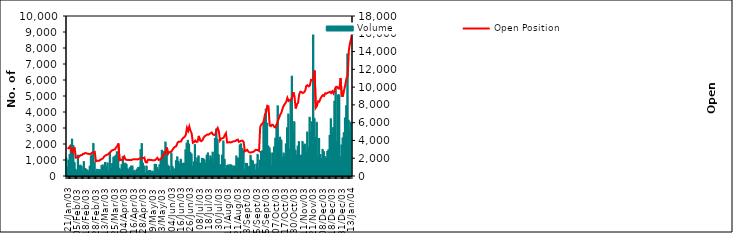
| Category | Volume |
|---|---|
| 2003-01-21 | 1124 |
| 2003-01-22 | 519 |
| 2003-01-23 | 961 |
| 2003-01-24 | 1317 |
| 2003-01-27 | 1909 |
| 2003-01-28 | 2274 |
| 2003-01-29 | 1876 |
| 2003-01-30 | 814 |
| 2003-02-05 | 387 |
| 2003-02-06 | 289 |
| 2003-02-07 | 1270 |
| 2003-02-10 | 597 |
| 2003-02-11 | 648 |
| 2003-02-13 | 585 |
| 2003-02-14 | 279 |
| 2003-02-17 | 871 |
| 2003-02-18 | 443 |
| 2003-02-19 | 394 |
| 2003-02-20 | 337 |
| 2003-02-21 | 273 |
| 2003-02-24 | 582 |
| 2003-02-25 | 1228 |
| 2003-02-26 | 1290 |
| 2003-02-27 | 2004 |
| 2003-02-28 | 819 |
| 2003-03-03 | 236 |
| 2003-03-05 | 389 |
| 2003-03-06 | 221 |
| 2003-03-07 | 376 |
| 2003-03-10 | 339 |
| 2003-03-11 | 620 |
| 2003-03-12 | 662 |
| 2003-03-13 | 519 |
| 2003-03-14 | 819 |
| 2003-03-17 | 548 |
| 2003-03-18 | 791 |
| 2003-03-19 | 304 |
| 2003-03-20 | 1456 |
| 2003-03-21 | 474 |
| 2003-03-24 | 748 |
| 2003-03-25 | 1135 |
| 2003-03-26 | 1189 |
| 2003-03-27 | 1266 |
| 2003-03-28 | 1488 |
| 2003-03-31 | 1140 |
| 2003-04-01 | 457 |
| 2003-04-02 | 374 |
| 2003-04-03 | 675 |
| 2003-04-04 | 1195 |
| 2003-04-07 | 727 |
| 2003-04-08 | 770 |
| 2003-04-09 | 712 |
| 2003-04-10 | 424 |
| 2003-04-11 | 341 |
| 2003-04-14 | 498 |
| 2003-04-15 | 587 |
| 2003-04-16 | 595 |
| 2003-04-17 | 248 |
| 2003-04-18 | 328 |
| 2003-04-21 | 167 |
| 2003-04-22 | 401 |
| 2003-04-23 | 493 |
| 2003-04-24 | 523 |
| 2003-04-25 | 1621 |
| 2003-04-28 | 1996 |
| 2003-04-29 | 770 |
| 2003-04-30 | 591 |
| 2003-05-02 | 148 |
| 2003-05-05 | 592 |
| 2003-05-06 | 250 |
| 2003-05-07 | 307 |
| 2003-05-08 | 318 |
| 2003-05-09 | 225 |
| 2003-05-12 | 275 |
| 2003-05-13 | 208 |
| 2003-05-16 | 699 |
| 2003-05-19 | 692 |
| 2003-05-20 | 506 |
| 2003-05-21 | 369 |
| 2003-05-22 | 663 |
| 2003-05-23 | 991 |
| 2003-05-26 | 1583 |
| 2003-05-27 | 1504 |
| 2003-05-28 | 1466 |
| 2003-05-29 | 2091 |
| 2003-05-30 | 1634 |
| 2003-06-02 | 654 |
| 2003-06-03 | 568 |
| 2003-06-04 | 286 |
| 2003-06-05 | 1412 |
| 2003-06-06 | 576 |
| 2003-06-09 | 379 |
| 2003-06-10 | 416 |
| 2003-06-11 | 926 |
| 2003-06-12 | 1169 |
| 2003-06-13 | 880 |
| 2003-06-16 | 705 |
| 2003-06-17 | 1016 |
| 2003-06-18 | 656 |
| 2003-06-19 | 764 |
| 2003-06-20 | 766 |
| 2003-06-23 | 1603 |
| 2003-06-24 | 2020 |
| 2003-06-25 | 2196 |
| 2003-06-26 | 1965 |
| 2003-06-27 | 1445 |
| 2003-06-30 | 1348 |
| 2003-07-01 | 589 |
| 2003-07-02 | 849 |
| 2003-07-03 | 1931 |
| 2003-07-04 | 856 |
| 2003-07-07 | 1110 |
| 2003-07-08 | 1231 |
| 2003-07-09 | 760 |
| 2003-07-10 | 771 |
| 2003-07-11 | 1073 |
| 2003-07-14 | 1064 |
| 2003-07-15 | 985 |
| 2003-07-16 | 759 |
| 2003-07-17 | 1275 |
| 2003-07-18 | 1413 |
| 2003-07-21 | 950 |
| 2003-07-22 | 1227 |
| 2003-07-23 | 1093 |
| 2003-07-24 | 1461 |
| 2003-07-25 | 813 |
| 2003-07-28 | 2318 |
| 2003-07-29 | 2908 |
| 2003-07-30 | 2265 |
| 2003-07-31 | 1306 |
| 2003-08-01 | 686 |
| 2003-08-04 | 651 |
| 2003-08-05 | 1273 |
| 2003-08-06 | 2160 |
| 2003-08-07 | 1020 |
| 2003-08-08 | 406 |
| 2003-08-11 | 622 |
| 2003-08-12 | 659 |
| 2003-08-13 | 617 |
| 2003-08-14 | 685 |
| 2003-08-15 | 641 |
| 2003-08-18 | 466 |
| 2003-08-19 | 600 |
| 2003-08-20 | 553 |
| 2003-08-21 | 1222 |
| 2003-08-22 | 1060 |
| 2003-08-25 | 1092 |
| 2003-08-26 | 1916 |
| 2003-08-27 | 1975 |
| 2003-08-28 | 1687 |
| 2003-08-29 | 1569 |
| 2003-09-02 | 400 |
| 2003-09-03 | 761 |
| 2003-09-04 | 752 |
| 2003-09-05 | 535 |
| 2003-09-08 | 579 |
| 2003-09-09 | 1261 |
| 2003-09-10 | 953 |
| 2003-09-11 | 912 |
| 2003-09-12 | 696 |
| 2003-09-15 | 337 |
| 2003-09-16 | 717 |
| 2003-09-17 | 1318 |
| 2003-09-18 | 384 |
| 2003-09-19 | 959 |
| 2003-09-22 | 1503 |
| 2003-09-23 | 1544 |
| 2003-09-24 | 3215 |
| 2003-09-25 | 3514 |
| 2003-09-26 | 4146 |
| 2003-09-29 | 3272 |
| 2003-09-30 | 1847 |
| 2003-10-01 | 1734 |
| 2003-10-02 | 1412 |
| 2003-10-03 | 620 |
| 2003-10-06 | 1410 |
| 2003-10-07 | 1785 |
| 2003-10-08 | 2331 |
| 2003-10-09 | 3202 |
| 2003-10-10 | 4356 |
| 2003-10-13 | 2135 |
| 2003-10-14 | 2397 |
| 2003-10-15 | 2215 |
| 2003-10-16 | 1155 |
| 2003-10-17 | 1408 |
| 2003-10-20 | 1180 |
| 2003-10-21 | 1978 |
| 2003-10-22 | 2985 |
| 2003-10-23 | 3841 |
| 2003-10-27 | 1641 |
| 2003-10-28 | 4717 |
| 2003-10-29 | 6208 |
| 2003-10-30 | 2787 |
| 2003-10-31 | 3365 |
| 2003-11-03 | 1583 |
| 2003-11-04 | 1278 |
| 2003-11-05 | 1835 |
| 2003-11-06 | 2118 |
| 2003-11-07 | 1262 |
| 2003-11-10 | 1272 |
| 2003-11-11 | 2129 |
| 2003-11-12 | 1863 |
| 2003-11-13 | 1965 |
| 2003-11-14 | 1483 |
| 2003-11-17 | 2717 |
| 2003-11-18 | 1769 |
| 2003-11-19 | 3640 |
| 2003-11-20 | 2735 |
| 2003-11-21 | 3358 |
| 2003-11-27 | 8967 |
| 2003-11-28 | 3576 |
| 2003-12-01 | 2371 |
| 2003-12-02 | 3327 |
| 2003-12-03 | 1158 |
| 2003-12-04 | 2317 |
| 2003-12-05 | 1311 |
| 2003-12-08 | 1056 |
| 2003-12-09 | 1633 |
| 2003-12-10 | 1497 |
| 2003-12-11 | 1177 |
| 2003-12-12 | 1062 |
| 2003-12-15 | 1512 |
| 2003-12-16 | 1606 |
| 2003-12-17 | 2504 |
| 2003-12-18 | 3546 |
| 2003-12-19 | 2705 |
| 2003-12-22 | 2994 |
| 2003-12-23 | 4642 |
| 2003-12-24 | 5455 |
| 2003-12-26 | 2109 |
| 2003-12-29 | 5034 |
| 2003-12-30 | 5044 |
| 2003-12-31 | 1159 |
| 2004-01-02 | 1907 |
| 2004-01-05 | 2348 |
| 2004-01-06 | 2675 |
| 2004-01-07 | 3596 |
| 2004-01-08 | 4363 |
| 2004-01-09 | 7596 |
| 2004-01-12 | 3451 |
| 2004-01-13 | 2800 |
| 2004-01-14 | 3324 |